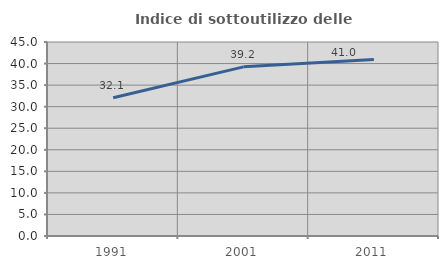
| Category | Indice di sottoutilizzo delle abitazioni  |
|---|---|
| 1991.0 | 32.084 |
| 2001.0 | 39.234 |
| 2011.0 | 40.964 |